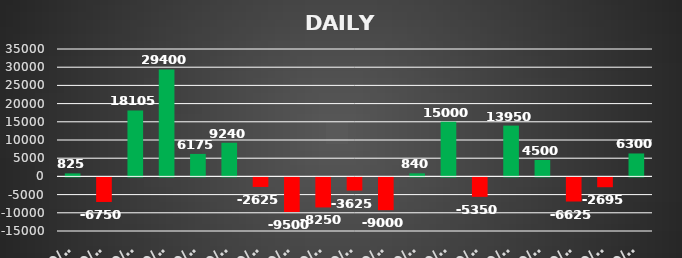
| Category | Series 0 |
|---|---|
| 2023-10-03 | 825 |
| 2023-10-03 | -6750 |
| 2023-10-04 | 18105 |
| 2023-10-05 | 29400 |
| 2023-10-06 | 6175 |
| 2023-10-09 | 9240 |
| 2023-10-10 | -2625 |
| 2023-10-11 | -9500 |
| 2023-10-12 | -8250 |
| 2023-10-13 | -3625 |
| 2023-10-16 | -9000 |
| 2023-10-17 | 840 |
| 2023-10-18 | 15000 |
| 2023-10-20 | -5350 |
| 2023-10-23 | 13950 |
| 2023-10-25 | 4500 |
| 2023-10-27 | -6625 |
| 2023-10-30 | -2695 |
| 2023-10-31 | 6300 |